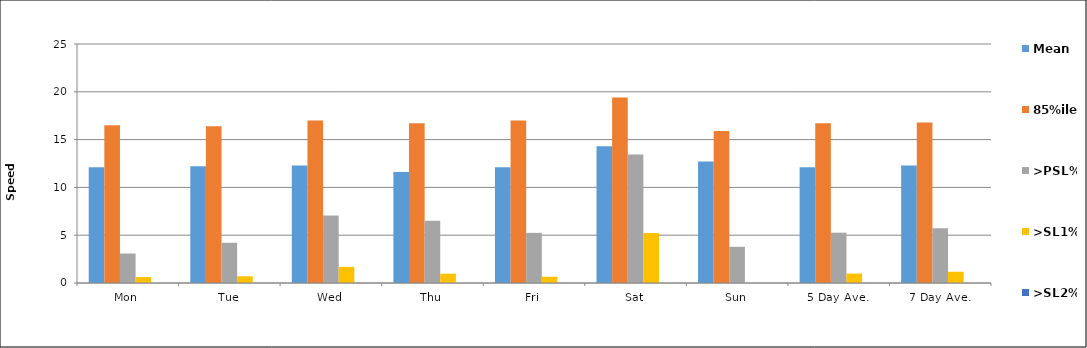
| Category | Mean | 85%ile | >PSL% | >SL1% | >SL2% |
|---|---|---|---|---|---|
| Mon | 12.1 | 16.5 | 3.086 | 0.617 | 0 |
| Tue | 12.2 | 16.4 | 4.211 | 0.702 | 0 |
| Wed | 12.3 | 17 | 7.071 | 1.684 | 0 |
| Thu | 11.6 | 16.7 | 6.515 | 0.977 | 0 |
| Fri | 12.1 | 17 | 5.246 | 0.656 | 0 |
| Sat | 14.3 | 19.4 | 13.43 | 5.224 | 0 |
| Sun | 12.7 | 15.9 | 3.788 | 0 | 0 |
| 5 Day Ave. | 12.1 | 16.7 | 5.263 | 0.987 | 0 |
| 7 Day Ave. | 12.3 | 16.8 | 5.717 | 1.177 | 0 |